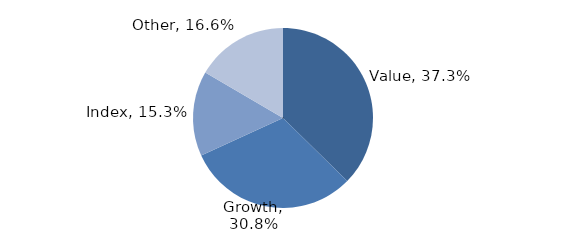
| Category | Investment Style |
|---|---|
| Value | 0.373 |
| Growth | 0.308 |
| Index | 0.153 |
| Other | 0.166 |